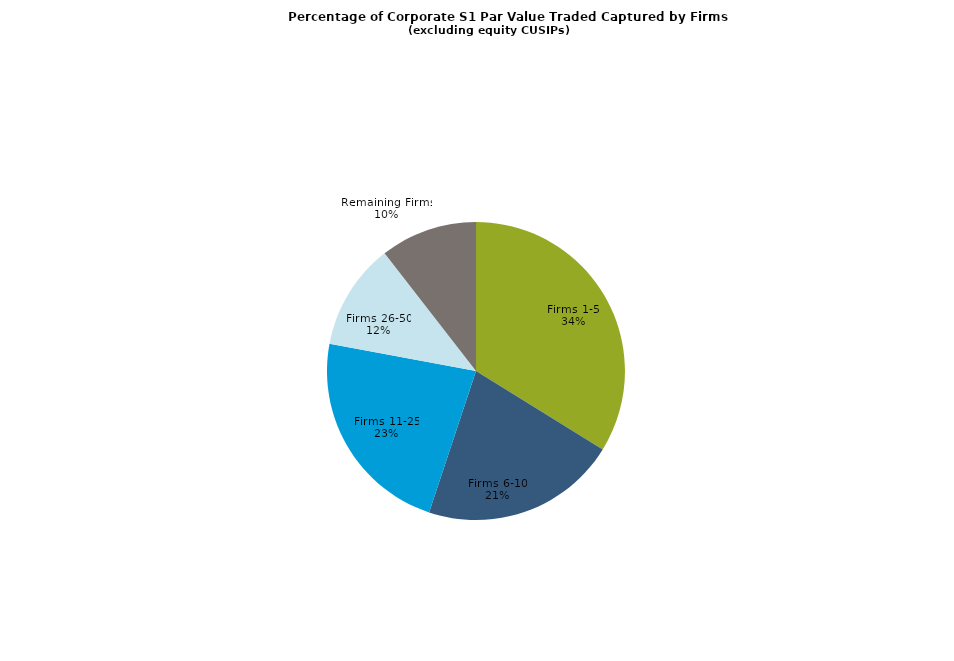
| Category | Series 0 |
|---|---|
| Firms 1-5 | 0.338 |
| Firms 6-10 | 0.213 |
| Firms 11-25 | 0.228 |
| Firms 26-50 | 0.116 |
| Remaining Firms | 0.105 |